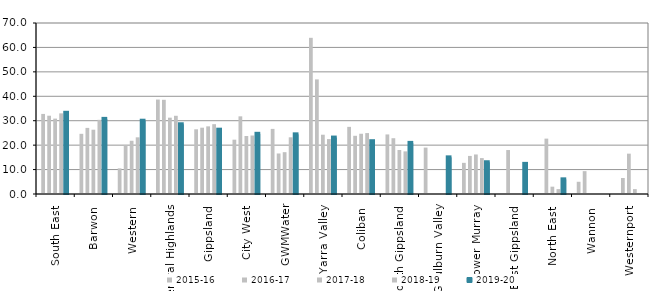
| Category | 2015-16 | 2016-17 | 2017-18 | 2018-19 | 2019-20 |
|---|---|---|---|---|---|
| South East  | 32.778 | 32.044 | 30.861 | 33.012 | 33.239 |
| Barwon  | 24.636 | 27.058 | 26.314 | 30.364 | 30.75 |
| Western  | 10.5 | 20 | 21.8 | 23.2 | 30 |
| Central Highlands  | 38.667 | 38.564 | 31.245 | 32.015 | 28.542 |
| Gippsland  | 26.481 | 27.146 | 27.69 | 28.584 | 26.329 |
| City West  | 22.234 | 31.793 | 23.746 | 23.945 | 24.643 |
| GWMWater | 26.65 | 16.586 | 17.118 | 23.206 | 24.419 |
| Yarra Valley  | 63.937 | 46.914 | 24.267 | 22.481 | 23.103 |
| Coliban  | 27.481 | 23.826 | 24.667 | 24.941 | 21.611 |
| South Gippsland  | 24.382 | 22.837 | 18.014 | 17.453 | 20.921 |
| Goulburn Valley  | 19 | 0 | 0 | 0 | 15 |
| Lower Murray  | 12.75 | 15.583 | 16.182 | 14.7 | 13 |
| East Gippsland  | 0 | 18 | 0 | 0 | 12.333 |
| North East  | 0 | 22.667 | 3 | 2 | 6 |
| Wannon  | 5 | 9.354 | 0 | 0 | 0 |
| Westernport  | 0 | 6.55 | 16.517 | 2 | 0 |